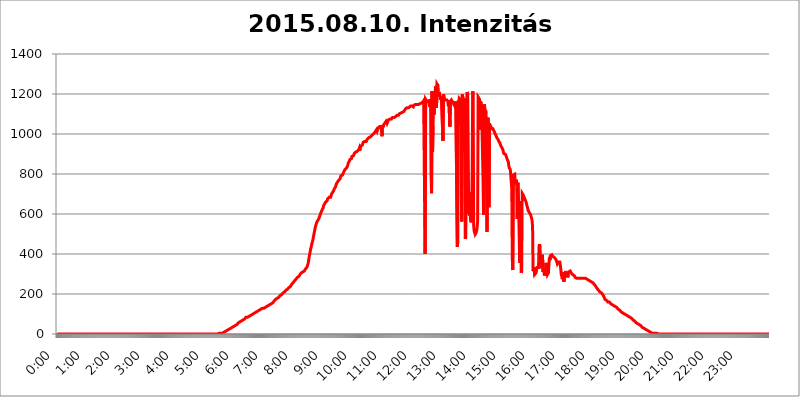
| Category | 2015.08.10. Intenzitás [W/m^2] |
|---|---|
| 0.0 | 0 |
| 0.0006944444444444445 | 0 |
| 0.001388888888888889 | 0 |
| 0.0020833333333333333 | 0 |
| 0.002777777777777778 | 0 |
| 0.003472222222222222 | 0 |
| 0.004166666666666667 | 0 |
| 0.004861111111111111 | 0 |
| 0.005555555555555556 | 0 |
| 0.0062499999999999995 | 0 |
| 0.006944444444444444 | 0 |
| 0.007638888888888889 | 0 |
| 0.008333333333333333 | 0 |
| 0.009027777777777779 | 0 |
| 0.009722222222222222 | 0 |
| 0.010416666666666666 | 0 |
| 0.011111111111111112 | 0 |
| 0.011805555555555555 | 0 |
| 0.012499999999999999 | 0 |
| 0.013194444444444444 | 0 |
| 0.013888888888888888 | 0 |
| 0.014583333333333332 | 0 |
| 0.015277777777777777 | 0 |
| 0.015972222222222224 | 0 |
| 0.016666666666666666 | 0 |
| 0.017361111111111112 | 0 |
| 0.018055555555555557 | 0 |
| 0.01875 | 0 |
| 0.019444444444444445 | 0 |
| 0.02013888888888889 | 0 |
| 0.020833333333333332 | 0 |
| 0.02152777777777778 | 0 |
| 0.022222222222222223 | 0 |
| 0.02291666666666667 | 0 |
| 0.02361111111111111 | 0 |
| 0.024305555555555556 | 0 |
| 0.024999999999999998 | 0 |
| 0.025694444444444447 | 0 |
| 0.02638888888888889 | 0 |
| 0.027083333333333334 | 0 |
| 0.027777777777777776 | 0 |
| 0.02847222222222222 | 0 |
| 0.029166666666666664 | 0 |
| 0.029861111111111113 | 0 |
| 0.030555555555555555 | 0 |
| 0.03125 | 0 |
| 0.03194444444444445 | 0 |
| 0.03263888888888889 | 0 |
| 0.03333333333333333 | 0 |
| 0.034027777777777775 | 0 |
| 0.034722222222222224 | 0 |
| 0.035416666666666666 | 0 |
| 0.036111111111111115 | 0 |
| 0.03680555555555556 | 0 |
| 0.0375 | 0 |
| 0.03819444444444444 | 0 |
| 0.03888888888888889 | 0 |
| 0.03958333333333333 | 0 |
| 0.04027777777777778 | 0 |
| 0.04097222222222222 | 0 |
| 0.041666666666666664 | 0 |
| 0.042361111111111106 | 0 |
| 0.04305555555555556 | 0 |
| 0.043750000000000004 | 0 |
| 0.044444444444444446 | 0 |
| 0.04513888888888889 | 0 |
| 0.04583333333333334 | 0 |
| 0.04652777777777778 | 0 |
| 0.04722222222222222 | 0 |
| 0.04791666666666666 | 0 |
| 0.04861111111111111 | 0 |
| 0.049305555555555554 | 0 |
| 0.049999999999999996 | 0 |
| 0.05069444444444445 | 0 |
| 0.051388888888888894 | 0 |
| 0.052083333333333336 | 0 |
| 0.05277777777777778 | 0 |
| 0.05347222222222222 | 0 |
| 0.05416666666666667 | 0 |
| 0.05486111111111111 | 0 |
| 0.05555555555555555 | 0 |
| 0.05625 | 0 |
| 0.05694444444444444 | 0 |
| 0.057638888888888885 | 0 |
| 0.05833333333333333 | 0 |
| 0.05902777777777778 | 0 |
| 0.059722222222222225 | 0 |
| 0.06041666666666667 | 0 |
| 0.061111111111111116 | 0 |
| 0.06180555555555556 | 0 |
| 0.0625 | 0 |
| 0.06319444444444444 | 0 |
| 0.06388888888888888 | 0 |
| 0.06458333333333334 | 0 |
| 0.06527777777777778 | 0 |
| 0.06597222222222222 | 0 |
| 0.06666666666666667 | 0 |
| 0.06736111111111111 | 0 |
| 0.06805555555555555 | 0 |
| 0.06874999999999999 | 0 |
| 0.06944444444444443 | 0 |
| 0.07013888888888889 | 0 |
| 0.07083333333333333 | 0 |
| 0.07152777777777779 | 0 |
| 0.07222222222222223 | 0 |
| 0.07291666666666667 | 0 |
| 0.07361111111111111 | 0 |
| 0.07430555555555556 | 0 |
| 0.075 | 0 |
| 0.07569444444444444 | 0 |
| 0.0763888888888889 | 0 |
| 0.07708333333333334 | 0 |
| 0.07777777777777778 | 0 |
| 0.07847222222222222 | 0 |
| 0.07916666666666666 | 0 |
| 0.0798611111111111 | 0 |
| 0.08055555555555556 | 0 |
| 0.08125 | 0 |
| 0.08194444444444444 | 0 |
| 0.08263888888888889 | 0 |
| 0.08333333333333333 | 0 |
| 0.08402777777777777 | 0 |
| 0.08472222222222221 | 0 |
| 0.08541666666666665 | 0 |
| 0.08611111111111112 | 0 |
| 0.08680555555555557 | 0 |
| 0.08750000000000001 | 0 |
| 0.08819444444444445 | 0 |
| 0.08888888888888889 | 0 |
| 0.08958333333333333 | 0 |
| 0.09027777777777778 | 0 |
| 0.09097222222222222 | 0 |
| 0.09166666666666667 | 0 |
| 0.09236111111111112 | 0 |
| 0.09305555555555556 | 0 |
| 0.09375 | 0 |
| 0.09444444444444444 | 0 |
| 0.09513888888888888 | 0 |
| 0.09583333333333333 | 0 |
| 0.09652777777777777 | 0 |
| 0.09722222222222222 | 0 |
| 0.09791666666666667 | 0 |
| 0.09861111111111111 | 0 |
| 0.09930555555555555 | 0 |
| 0.09999999999999999 | 0 |
| 0.10069444444444443 | 0 |
| 0.1013888888888889 | 0 |
| 0.10208333333333335 | 0 |
| 0.10277777777777779 | 0 |
| 0.10347222222222223 | 0 |
| 0.10416666666666667 | 0 |
| 0.10486111111111111 | 0 |
| 0.10555555555555556 | 0 |
| 0.10625 | 0 |
| 0.10694444444444444 | 0 |
| 0.1076388888888889 | 0 |
| 0.10833333333333334 | 0 |
| 0.10902777777777778 | 0 |
| 0.10972222222222222 | 0 |
| 0.1111111111111111 | 0 |
| 0.11180555555555556 | 0 |
| 0.11180555555555556 | 0 |
| 0.1125 | 0 |
| 0.11319444444444444 | 0 |
| 0.11388888888888889 | 0 |
| 0.11458333333333333 | 0 |
| 0.11527777777777777 | 0 |
| 0.11597222222222221 | 0 |
| 0.11666666666666665 | 0 |
| 0.1173611111111111 | 0 |
| 0.11805555555555557 | 0 |
| 0.11944444444444445 | 0 |
| 0.12013888888888889 | 0 |
| 0.12083333333333333 | 0 |
| 0.12152777777777778 | 0 |
| 0.12222222222222223 | 0 |
| 0.12291666666666667 | 0 |
| 0.12291666666666667 | 0 |
| 0.12361111111111112 | 0 |
| 0.12430555555555556 | 0 |
| 0.125 | 0 |
| 0.12569444444444444 | 0 |
| 0.12638888888888888 | 0 |
| 0.12708333333333333 | 0 |
| 0.16875 | 0 |
| 0.12847222222222224 | 0 |
| 0.12916666666666668 | 0 |
| 0.12986111111111112 | 0 |
| 0.13055555555555556 | 0 |
| 0.13125 | 0 |
| 0.13194444444444445 | 0 |
| 0.1326388888888889 | 0 |
| 0.13333333333333333 | 0 |
| 0.13402777777777777 | 0 |
| 0.13402777777777777 | 0 |
| 0.13472222222222222 | 0 |
| 0.13541666666666666 | 0 |
| 0.1361111111111111 | 0 |
| 0.13749999999999998 | 0 |
| 0.13819444444444443 | 0 |
| 0.1388888888888889 | 0 |
| 0.13958333333333334 | 0 |
| 0.14027777777777778 | 0 |
| 0.14097222222222222 | 0 |
| 0.14166666666666666 | 0 |
| 0.1423611111111111 | 0 |
| 0.14305555555555557 | 0 |
| 0.14375000000000002 | 0 |
| 0.14444444444444446 | 0 |
| 0.1451388888888889 | 0 |
| 0.1451388888888889 | 0 |
| 0.14652777777777778 | 0 |
| 0.14722222222222223 | 0 |
| 0.14791666666666667 | 0 |
| 0.1486111111111111 | 0 |
| 0.14930555555555555 | 0 |
| 0.15 | 0 |
| 0.15069444444444444 | 0 |
| 0.15138888888888888 | 0 |
| 0.15208333333333332 | 0 |
| 0.15277777777777776 | 0 |
| 0.15347222222222223 | 0 |
| 0.15416666666666667 | 0 |
| 0.15486111111111112 | 0 |
| 0.15555555555555556 | 0 |
| 0.15625 | 0 |
| 0.15694444444444444 | 0 |
| 0.15763888888888888 | 0 |
| 0.15833333333333333 | 0 |
| 0.15902777777777777 | 0 |
| 0.15972222222222224 | 0 |
| 0.16041666666666668 | 0 |
| 0.16111111111111112 | 0 |
| 0.16180555555555556 | 0 |
| 0.1625 | 0 |
| 0.16319444444444445 | 0 |
| 0.1638888888888889 | 0 |
| 0.16458333333333333 | 0 |
| 0.16527777777777777 | 0 |
| 0.16597222222222222 | 0 |
| 0.16666666666666666 | 0 |
| 0.1673611111111111 | 0 |
| 0.16805555555555554 | 0 |
| 0.16874999999999998 | 0 |
| 0.16944444444444443 | 0 |
| 0.17013888888888887 | 0 |
| 0.1708333333333333 | 0 |
| 0.17152777777777775 | 0 |
| 0.17222222222222225 | 0 |
| 0.1729166666666667 | 0 |
| 0.17361111111111113 | 0 |
| 0.17430555555555557 | 0 |
| 0.17500000000000002 | 0 |
| 0.17569444444444446 | 0 |
| 0.1763888888888889 | 0 |
| 0.17708333333333334 | 0 |
| 0.17777777777777778 | 0 |
| 0.17847222222222223 | 0 |
| 0.17916666666666667 | 0 |
| 0.1798611111111111 | 0 |
| 0.18055555555555555 | 0 |
| 0.18125 | 0 |
| 0.18194444444444444 | 0 |
| 0.1826388888888889 | 0 |
| 0.18333333333333335 | 0 |
| 0.1840277777777778 | 0 |
| 0.18472222222222223 | 0 |
| 0.18541666666666667 | 0 |
| 0.18611111111111112 | 0 |
| 0.18680555555555556 | 0 |
| 0.1875 | 0 |
| 0.18819444444444444 | 0 |
| 0.18888888888888888 | 0 |
| 0.18958333333333333 | 0 |
| 0.19027777777777777 | 0 |
| 0.1909722222222222 | 0 |
| 0.19166666666666665 | 0 |
| 0.19236111111111112 | 0 |
| 0.19305555555555554 | 0 |
| 0.19375 | 0 |
| 0.19444444444444445 | 0 |
| 0.1951388888888889 | 0 |
| 0.19583333333333333 | 0 |
| 0.19652777777777777 | 0 |
| 0.19722222222222222 | 0 |
| 0.19791666666666666 | 0 |
| 0.1986111111111111 | 0 |
| 0.19930555555555554 | 0 |
| 0.19999999999999998 | 0 |
| 0.20069444444444443 | 0 |
| 0.20138888888888887 | 0 |
| 0.2020833333333333 | 0 |
| 0.2027777777777778 | 0 |
| 0.2034722222222222 | 0 |
| 0.2041666666666667 | 0 |
| 0.20486111111111113 | 0 |
| 0.20555555555555557 | 0 |
| 0.20625000000000002 | 0 |
| 0.20694444444444446 | 0 |
| 0.2076388888888889 | 0 |
| 0.20833333333333334 | 0 |
| 0.20902777777777778 | 0 |
| 0.20972222222222223 | 0 |
| 0.21041666666666667 | 0 |
| 0.2111111111111111 | 0 |
| 0.21180555555555555 | 0 |
| 0.2125 | 0 |
| 0.21319444444444444 | 0 |
| 0.2138888888888889 | 0 |
| 0.21458333333333335 | 0 |
| 0.2152777777777778 | 0 |
| 0.21597222222222223 | 0 |
| 0.21666666666666667 | 0 |
| 0.21736111111111112 | 0 |
| 0.21805555555555556 | 0 |
| 0.21875 | 0 |
| 0.21944444444444444 | 0 |
| 0.22013888888888888 | 0 |
| 0.22083333333333333 | 0 |
| 0.22152777777777777 | 0 |
| 0.2222222222222222 | 0 |
| 0.22291666666666665 | 0 |
| 0.2236111111111111 | 0 |
| 0.22430555555555556 | 0 |
| 0.225 | 0 |
| 0.22569444444444445 | 0 |
| 0.2263888888888889 | 0 |
| 0.22708333333333333 | 3.525 |
| 0.22777777777777777 | 0 |
| 0.22847222222222222 | 3.525 |
| 0.22916666666666666 | 3.525 |
| 0.2298611111111111 | 3.525 |
| 0.23055555555555554 | 3.525 |
| 0.23124999999999998 | 3.525 |
| 0.23194444444444443 | 3.525 |
| 0.23263888888888887 | 7.887 |
| 0.2333333333333333 | 7.887 |
| 0.2340277777777778 | 7.887 |
| 0.2347222222222222 | 12.257 |
| 0.2354166666666667 | 12.257 |
| 0.23611111111111113 | 12.257 |
| 0.23680555555555557 | 12.257 |
| 0.23750000000000002 | 16.636 |
| 0.23819444444444446 | 16.636 |
| 0.2388888888888889 | 16.636 |
| 0.23958333333333334 | 21.024 |
| 0.24027777777777778 | 21.024 |
| 0.24097222222222223 | 25.419 |
| 0.24166666666666667 | 25.419 |
| 0.2423611111111111 | 25.419 |
| 0.24305555555555555 | 29.823 |
| 0.24375 | 29.823 |
| 0.24444444444444446 | 34.234 |
| 0.24513888888888888 | 34.234 |
| 0.24583333333333335 | 34.234 |
| 0.2465277777777778 | 38.653 |
| 0.24722222222222223 | 38.653 |
| 0.24791666666666667 | 38.653 |
| 0.24861111111111112 | 43.079 |
| 0.24930555555555556 | 43.079 |
| 0.25 | 43.079 |
| 0.25069444444444444 | 47.511 |
| 0.2513888888888889 | 47.511 |
| 0.2520833333333333 | 47.511 |
| 0.25277777777777777 | 51.951 |
| 0.2534722222222222 | 51.951 |
| 0.25416666666666665 | 56.398 |
| 0.2548611111111111 | 56.398 |
| 0.2555555555555556 | 60.85 |
| 0.25625000000000003 | 60.85 |
| 0.2569444444444445 | 60.85 |
| 0.2576388888888889 | 65.31 |
| 0.25833333333333336 | 65.31 |
| 0.2590277777777778 | 65.31 |
| 0.25972222222222224 | 69.775 |
| 0.2604166666666667 | 69.775 |
| 0.2611111111111111 | 74.246 |
| 0.26180555555555557 | 74.246 |
| 0.2625 | 74.246 |
| 0.26319444444444445 | 78.722 |
| 0.2638888888888889 | 78.722 |
| 0.26458333333333334 | 83.205 |
| 0.2652777777777778 | 83.205 |
| 0.2659722222222222 | 83.205 |
| 0.26666666666666666 | 83.205 |
| 0.2673611111111111 | 83.205 |
| 0.26805555555555555 | 87.692 |
| 0.26875 | 87.692 |
| 0.26944444444444443 | 87.692 |
| 0.2701388888888889 | 92.184 |
| 0.2708333333333333 | 92.184 |
| 0.27152777777777776 | 92.184 |
| 0.2722222222222222 | 96.682 |
| 0.27291666666666664 | 96.682 |
| 0.2736111111111111 | 96.682 |
| 0.2743055555555555 | 101.184 |
| 0.27499999999999997 | 101.184 |
| 0.27569444444444446 | 101.184 |
| 0.27638888888888885 | 105.69 |
| 0.27708333333333335 | 105.69 |
| 0.2777777777777778 | 105.69 |
| 0.27847222222222223 | 110.201 |
| 0.2791666666666667 | 110.201 |
| 0.2798611111111111 | 110.201 |
| 0.28055555555555556 | 114.716 |
| 0.28125 | 114.716 |
| 0.28194444444444444 | 114.716 |
| 0.2826388888888889 | 119.235 |
| 0.2833333333333333 | 119.235 |
| 0.28402777777777777 | 119.235 |
| 0.2847222222222222 | 119.235 |
| 0.28541666666666665 | 123.758 |
| 0.28611111111111115 | 123.758 |
| 0.28680555555555554 | 123.758 |
| 0.28750000000000003 | 128.284 |
| 0.2881944444444445 | 128.284 |
| 0.2888888888888889 | 128.284 |
| 0.28958333333333336 | 128.284 |
| 0.2902777777777778 | 128.284 |
| 0.29097222222222224 | 132.814 |
| 0.2916666666666667 | 132.814 |
| 0.2923611111111111 | 132.814 |
| 0.29305555555555557 | 137.347 |
| 0.29375 | 137.347 |
| 0.29444444444444445 | 137.347 |
| 0.2951388888888889 | 141.884 |
| 0.29583333333333334 | 141.884 |
| 0.2965277777777778 | 141.884 |
| 0.2972222222222222 | 146.423 |
| 0.29791666666666666 | 146.423 |
| 0.2986111111111111 | 146.423 |
| 0.29930555555555555 | 150.964 |
| 0.3 | 150.964 |
| 0.30069444444444443 | 150.964 |
| 0.3013888888888889 | 155.509 |
| 0.3020833333333333 | 155.509 |
| 0.30277777777777776 | 155.509 |
| 0.3034722222222222 | 160.056 |
| 0.30416666666666664 | 164.605 |
| 0.3048611111111111 | 164.605 |
| 0.3055555555555555 | 169.156 |
| 0.30624999999999997 | 173.709 |
| 0.3069444444444444 | 173.709 |
| 0.3076388888888889 | 173.709 |
| 0.30833333333333335 | 178.264 |
| 0.3090277777777778 | 178.264 |
| 0.30972222222222223 | 182.82 |
| 0.3104166666666667 | 182.82 |
| 0.3111111111111111 | 187.378 |
| 0.31180555555555556 | 187.378 |
| 0.3125 | 191.937 |
| 0.31319444444444444 | 191.937 |
| 0.3138888888888889 | 196.497 |
| 0.3145833333333333 | 196.497 |
| 0.31527777777777777 | 201.058 |
| 0.3159722222222222 | 201.058 |
| 0.31666666666666665 | 205.62 |
| 0.31736111111111115 | 210.182 |
| 0.31805555555555554 | 210.182 |
| 0.31875000000000003 | 210.182 |
| 0.3194444444444445 | 214.746 |
| 0.3201388888888889 | 214.746 |
| 0.32083333333333336 | 219.309 |
| 0.3215277777777778 | 219.309 |
| 0.32222222222222224 | 223.873 |
| 0.3229166666666667 | 223.873 |
| 0.3236111111111111 | 228.436 |
| 0.32430555555555557 | 228.436 |
| 0.325 | 233 |
| 0.32569444444444445 | 233 |
| 0.3263888888888889 | 237.564 |
| 0.32708333333333334 | 237.564 |
| 0.3277777777777778 | 242.127 |
| 0.3284722222222222 | 246.689 |
| 0.32916666666666666 | 246.689 |
| 0.3298611111111111 | 251.251 |
| 0.33055555555555555 | 255.813 |
| 0.33125 | 260.373 |
| 0.33194444444444443 | 260.373 |
| 0.3326388888888889 | 264.932 |
| 0.3333333333333333 | 269.49 |
| 0.3340277777777778 | 269.49 |
| 0.3347222222222222 | 274.047 |
| 0.3354166666666667 | 278.603 |
| 0.3361111111111111 | 278.603 |
| 0.3368055555555556 | 283.156 |
| 0.33749999999999997 | 283.156 |
| 0.33819444444444446 | 287.709 |
| 0.33888888888888885 | 287.709 |
| 0.33958333333333335 | 292.259 |
| 0.34027777777777773 | 296.808 |
| 0.34097222222222223 | 296.808 |
| 0.3416666666666666 | 301.354 |
| 0.3423611111111111 | 305.898 |
| 0.3430555555555555 | 305.898 |
| 0.34375 | 305.898 |
| 0.3444444444444445 | 310.44 |
| 0.3451388888888889 | 314.98 |
| 0.3458333333333334 | 314.98 |
| 0.34652777777777777 | 314.98 |
| 0.34722222222222227 | 319.517 |
| 0.34791666666666665 | 324.052 |
| 0.34861111111111115 | 324.052 |
| 0.34930555555555554 | 328.584 |
| 0.35000000000000003 | 333.113 |
| 0.3506944444444444 | 337.639 |
| 0.3513888888888889 | 346.682 |
| 0.3520833333333333 | 355.712 |
| 0.3527777777777778 | 373.729 |
| 0.3534722222222222 | 387.202 |
| 0.3541666666666667 | 400.638 |
| 0.3548611111111111 | 414.035 |
| 0.35555555555555557 | 427.39 |
| 0.35625 | 436.27 |
| 0.35694444444444445 | 449.551 |
| 0.3576388888888889 | 453.968 |
| 0.35833333333333334 | 467.187 |
| 0.3590277777777778 | 480.356 |
| 0.3597222222222222 | 493.475 |
| 0.36041666666666666 | 506.542 |
| 0.3611111111111111 | 519.555 |
| 0.36180555555555555 | 532.513 |
| 0.3625 | 541.121 |
| 0.36319444444444443 | 545.416 |
| 0.3638888888888889 | 558.261 |
| 0.3645833333333333 | 562.53 |
| 0.3652777777777778 | 566.793 |
| 0.3659722222222222 | 571.049 |
| 0.3666666666666667 | 575.299 |
| 0.3673611111111111 | 579.542 |
| 0.3680555555555556 | 588.009 |
| 0.36874999999999997 | 596.45 |
| 0.36944444444444446 | 600.661 |
| 0.37013888888888885 | 609.062 |
| 0.37083333333333335 | 613.252 |
| 0.37152777777777773 | 621.613 |
| 0.37222222222222223 | 625.784 |
| 0.3729166666666666 | 629.948 |
| 0.3736111111111111 | 642.4 |
| 0.3743055555555555 | 646.537 |
| 0.375 | 650.667 |
| 0.3756944444444445 | 654.791 |
| 0.3763888888888889 | 658.909 |
| 0.3770833333333334 | 658.909 |
| 0.37777777777777777 | 663.019 |
| 0.37847222222222227 | 667.123 |
| 0.37916666666666665 | 675.311 |
| 0.37986111111111115 | 675.311 |
| 0.38055555555555554 | 679.395 |
| 0.38125000000000003 | 683.473 |
| 0.3819444444444444 | 687.544 |
| 0.3826388888888889 | 687.544 |
| 0.3833333333333333 | 683.473 |
| 0.3840277777777778 | 691.608 |
| 0.3847222222222222 | 699.717 |
| 0.3854166666666667 | 703.762 |
| 0.3861111111111111 | 707.8 |
| 0.38680555555555557 | 711.832 |
| 0.3875 | 715.858 |
| 0.38819444444444445 | 719.877 |
| 0.3888888888888889 | 727.896 |
| 0.38958333333333334 | 727.896 |
| 0.3902777777777778 | 735.89 |
| 0.3909722222222222 | 743.859 |
| 0.39166666666666666 | 751.803 |
| 0.3923611111111111 | 755.766 |
| 0.39305555555555555 | 759.723 |
| 0.39375 | 763.674 |
| 0.39444444444444443 | 767.62 |
| 0.3951388888888889 | 767.62 |
| 0.3958333333333333 | 771.559 |
| 0.3965277777777778 | 775.492 |
| 0.3972222222222222 | 783.342 |
| 0.3979166666666667 | 791.169 |
| 0.3986111111111111 | 787.258 |
| 0.3993055555555556 | 791.169 |
| 0.39999999999999997 | 795.074 |
| 0.40069444444444446 | 798.974 |
| 0.40138888888888885 | 806.757 |
| 0.40208333333333335 | 810.641 |
| 0.40277777777777773 | 810.641 |
| 0.40347222222222223 | 822.26 |
| 0.4041666666666666 | 822.26 |
| 0.4048611111111111 | 826.123 |
| 0.4055555555555555 | 829.981 |
| 0.40625 | 833.834 |
| 0.4069444444444445 | 837.682 |
| 0.4076388888888889 | 841.526 |
| 0.4083333333333334 | 856.855 |
| 0.40902777777777777 | 860.676 |
| 0.40972222222222227 | 864.493 |
| 0.41041666666666665 | 872.114 |
| 0.41111111111111115 | 872.114 |
| 0.41180555555555554 | 875.918 |
| 0.41250000000000003 | 875.918 |
| 0.4131944444444444 | 887.309 |
| 0.4138888888888889 | 887.309 |
| 0.4145833333333333 | 887.309 |
| 0.4152777777777778 | 891.099 |
| 0.4159722222222222 | 894.885 |
| 0.4166666666666667 | 902.447 |
| 0.4173611111111111 | 902.447 |
| 0.41805555555555557 | 902.447 |
| 0.41875 | 909.996 |
| 0.41944444444444445 | 913.766 |
| 0.4201388888888889 | 913.766 |
| 0.42083333333333334 | 913.766 |
| 0.4215277777777778 | 913.766 |
| 0.4222222222222222 | 913.766 |
| 0.42291666666666666 | 921.298 |
| 0.4236111111111111 | 928.819 |
| 0.42430555555555555 | 917.534 |
| 0.425 | 932.576 |
| 0.42569444444444443 | 940.082 |
| 0.4263888888888889 | 943.832 |
| 0.4270833333333333 | 940.082 |
| 0.4277777777777778 | 943.832 |
| 0.4284722222222222 | 951.327 |
| 0.4291666666666667 | 958.814 |
| 0.4298611111111111 | 958.814 |
| 0.4305555555555556 | 962.555 |
| 0.43124999999999997 | 962.555 |
| 0.43194444444444446 | 966.295 |
| 0.43263888888888885 | 962.555 |
| 0.43333333333333335 | 962.555 |
| 0.43402777777777773 | 966.295 |
| 0.43472222222222223 | 973.772 |
| 0.4354166666666666 | 977.508 |
| 0.4361111111111111 | 977.508 |
| 0.4368055555555555 | 981.244 |
| 0.4375 | 981.244 |
| 0.4381944444444445 | 984.98 |
| 0.4388888888888889 | 984.98 |
| 0.4395833333333334 | 984.98 |
| 0.44027777777777777 | 988.714 |
| 0.44097222222222227 | 992.448 |
| 0.44166666666666665 | 992.448 |
| 0.44236111111111115 | 996.182 |
| 0.44305555555555554 | 999.916 |
| 0.44375000000000003 | 999.916 |
| 0.4444444444444444 | 999.916 |
| 0.4451388888888889 | 1007.383 |
| 0.4458333333333333 | 1011.118 |
| 0.4465277777777778 | 1014.852 |
| 0.4472222222222222 | 1014.852 |
| 0.4479166666666667 | 1022.323 |
| 0.4486111111111111 | 1014.852 |
| 0.44930555555555557 | 1022.323 |
| 0.45 | 1029.798 |
| 0.45069444444444445 | 1026.06 |
| 0.4513888888888889 | 1033.537 |
| 0.45208333333333334 | 1037.277 |
| 0.4527777777777778 | 1037.277 |
| 0.4534722222222222 | 1033.537 |
| 0.45416666666666666 | 1037.277 |
| 0.4548611111111111 | 1037.277 |
| 0.45555555555555555 | 988.714 |
| 0.45625 | 1044.762 |
| 0.45694444444444443 | 1033.537 |
| 0.4576388888888889 | 1044.762 |
| 0.4583333333333333 | 1044.762 |
| 0.4590277777777778 | 1052.255 |
| 0.4597222222222222 | 1052.255 |
| 0.4604166666666667 | 1056.004 |
| 0.4611111111111111 | 1063.51 |
| 0.4618055555555556 | 1063.51 |
| 0.46249999999999997 | 1052.255 |
| 0.46319444444444446 | 1056.004 |
| 0.46388888888888885 | 1052.255 |
| 0.46458333333333335 | 1071.027 |
| 0.46527777777777773 | 1071.027 |
| 0.46597222222222223 | 1071.027 |
| 0.4666666666666666 | 1074.789 |
| 0.4673611111111111 | 1074.789 |
| 0.4680555555555555 | 1074.789 |
| 0.46875 | 1074.789 |
| 0.4694444444444445 | 1078.555 |
| 0.4701388888888889 | 1082.324 |
| 0.4708333333333334 | 1078.555 |
| 0.47152777777777777 | 1082.324 |
| 0.47222222222222227 | 1082.324 |
| 0.47291666666666665 | 1086.097 |
| 0.47361111111111115 | 1086.097 |
| 0.47430555555555554 | 1086.097 |
| 0.47500000000000003 | 1089.873 |
| 0.4756944444444444 | 1089.873 |
| 0.4763888888888889 | 1093.653 |
| 0.4770833333333333 | 1093.653 |
| 0.4777777777777778 | 1093.653 |
| 0.4784722222222222 | 1093.653 |
| 0.4791666666666667 | 1097.437 |
| 0.4798611111111111 | 1101.226 |
| 0.48055555555555557 | 1105.019 |
| 0.48125 | 1105.019 |
| 0.48194444444444445 | 1105.019 |
| 0.4826388888888889 | 1105.019 |
| 0.48333333333333334 | 1105.019 |
| 0.4840277777777778 | 1108.816 |
| 0.4847222222222222 | 1108.816 |
| 0.48541666666666666 | 1112.618 |
| 0.4861111111111111 | 1112.618 |
| 0.48680555555555555 | 1116.426 |
| 0.4875 | 1120.238 |
| 0.48819444444444443 | 1124.056 |
| 0.4888888888888889 | 1127.879 |
| 0.4895833333333333 | 1127.879 |
| 0.4902777777777778 | 1127.879 |
| 0.4909722222222222 | 1131.708 |
| 0.4916666666666667 | 1131.708 |
| 0.4923611111111111 | 1131.708 |
| 0.4930555555555556 | 1131.708 |
| 0.49374999999999997 | 1135.543 |
| 0.49444444444444446 | 1135.543 |
| 0.49513888888888885 | 1139.384 |
| 0.49583333333333335 | 1135.543 |
| 0.49652777777777773 | 1139.384 |
| 0.49722222222222223 | 1139.384 |
| 0.4979166666666666 | 1139.384 |
| 0.4986111111111111 | 1143.232 |
| 0.4993055555555555 | 1135.543 |
| 0.5 | 1143.232 |
| 0.5006944444444444 | 1147.086 |
| 0.5013888888888889 | 1147.086 |
| 0.5020833333333333 | 1147.086 |
| 0.5027777777777778 | 1147.086 |
| 0.5034722222222222 | 1147.086 |
| 0.5041666666666667 | 1147.086 |
| 0.5048611111111111 | 1147.086 |
| 0.5055555555555555 | 1147.086 |
| 0.50625 | 1147.086 |
| 0.5069444444444444 | 1147.086 |
| 0.5076388888888889 | 1147.086 |
| 0.5083333333333333 | 1150.946 |
| 0.5090277777777777 | 1150.946 |
| 0.5097222222222222 | 1154.814 |
| 0.5104166666666666 | 1154.814 |
| 0.5111111111111112 | 1158.689 |
| 0.5118055555555555 | 1158.689 |
| 0.5125000000000001 | 1158.689 |
| 0.5131944444444444 | 1154.814 |
| 0.513888888888889 | 1166.46 |
| 0.5145833333333333 | 1170.358 |
| 0.5152777777777778 | 1166.46 |
| 0.5159722222222222 | 400.638 |
| 0.5166666666666667 | 1174.263 |
| 0.517361111111111 | 1174.263 |
| 0.5180555555555556 | 1166.46 |
| 0.5187499999999999 | 1166.46 |
| 0.5194444444444445 | 1170.358 |
| 0.5201388888888888 | 1162.571 |
| 0.5208333333333334 | 1162.571 |
| 0.5215277777777778 | 1154.814 |
| 0.5222222222222223 | 1135.543 |
| 0.5229166666666667 | 1174.263 |
| 0.5236111111111111 | 1162.571 |
| 0.5243055555555556 | 795.074 |
| 0.525 | 703.762 |
| 0.5256944444444445 | 1213.804 |
| 0.5263888888888889 | 909.996 |
| 0.5270833333333333 | 1041.019 |
| 0.5277777777777778 | 1170.358 |
| 0.5284722222222222 | 1097.437 |
| 0.5291666666666667 | 1186.03 |
| 0.5298611111111111 | 1193.918 |
| 0.5305555555555556 | 1238.014 |
| 0.53125 | 1242.089 |
| 0.5319444444444444 | 1131.708 |
| 0.5326388888888889 | 1250.275 |
| 0.5333333333333333 | 1250.275 |
| 0.5340277777777778 | 1242.089 |
| 0.5347222222222222 | 1186.03 |
| 0.5354166666666667 | 1209.807 |
| 0.5361111111111111 | 1205.82 |
| 0.5368055555555555 | 1189.969 |
| 0.5375 | 1170.358 |
| 0.5381944444444444 | 1178.177 |
| 0.5388888888888889 | 1189.969 |
| 0.5395833333333333 | 1189.969 |
| 0.5402777777777777 | 1186.03 |
| 0.5409722222222222 | 966.295 |
| 0.5416666666666666 | 1197.876 |
| 0.5423611111111112 | 1189.969 |
| 0.5430555555555555 | 1178.177 |
| 0.5437500000000001 | 1178.177 |
| 0.5444444444444444 | 1170.358 |
| 0.545138888888889 | 1174.263 |
| 0.5458333333333333 | 1170.358 |
| 0.5465277777777778 | 1170.358 |
| 0.5472222222222222 | 1170.358 |
| 0.5479166666666667 | 1162.571 |
| 0.548611111111111 | 1139.384 |
| 0.5493055555555556 | 1166.46 |
| 0.5499999999999999 | 1162.571 |
| 0.5506944444444445 | 1037.277 |
| 0.5513888888888888 | 1162.571 |
| 0.5520833333333334 | 1166.46 |
| 0.5527777777777778 | 1170.358 |
| 0.5534722222222223 | 1166.46 |
| 0.5541666666666667 | 1162.571 |
| 0.5548611111111111 | 1162.571 |
| 0.5555555555555556 | 1154.814 |
| 0.55625 | 1147.086 |
| 0.5569444444444445 | 1147.086 |
| 0.5576388888888889 | 1139.384 |
| 0.5583333333333333 | 1154.814 |
| 0.5590277777777778 | 1162.571 |
| 0.5597222222222222 | 1162.571 |
| 0.5604166666666667 | 1162.571 |
| 0.5611111111111111 | 436.27 |
| 0.5618055555555556 | 462.786 |
| 0.5625 | 1166.46 |
| 0.5631944444444444 | 1044.762 |
| 0.5638888888888889 | 1178.177 |
| 0.5645833333333333 | 1174.263 |
| 0.5652777777777778 | 1174.263 |
| 0.5659722222222222 | 1170.358 |
| 0.5666666666666667 | 707.8 |
| 0.5673611111111111 | 562.53 |
| 0.5680555555555555 | 1197.876 |
| 0.56875 | 1186.03 |
| 0.5694444444444444 | 1178.177 |
| 0.5701388888888889 | 909.996 |
| 0.5708333333333333 | 1178.177 |
| 0.5715277777777777 | 1154.814 |
| 0.5722222222222222 | 475.972 |
| 0.5729166666666666 | 484.735 |
| 0.5736111111111112 | 703.762 |
| 0.5743055555555555 | 600.661 |
| 0.5750000000000001 | 1209.807 |
| 0.5756944444444444 | 1201.843 |
| 0.576388888888889 | 1201.843 |
| 0.5770833333333333 | 604.864 |
| 0.5777777777777778 | 707.8 |
| 0.5784722222222222 | 592.233 |
| 0.5791666666666667 | 642.4 |
| 0.579861111111111 | 566.793 |
| 0.5805555555555556 | 558.261 |
| 0.5812499999999999 | 579.542 |
| 0.5819444444444445 | 795.074 |
| 0.5826388888888888 | 1213.804 |
| 0.5833333333333334 | 1197.876 |
| 0.5840277777777778 | 541.121 |
| 0.5847222222222223 | 515.223 |
| 0.5854166666666667 | 506.542 |
| 0.5861111111111111 | 497.836 |
| 0.5868055555555556 | 497.836 |
| 0.5875 | 506.542 |
| 0.5881944444444445 | 515.223 |
| 0.5888888888888889 | 532.513 |
| 0.5895833333333333 | 562.53 |
| 0.5902777777777778 | 1186.03 |
| 0.5909722222222222 | 1186.03 |
| 0.5916666666666667 | 1178.177 |
| 0.5923611111111111 | 1170.358 |
| 0.5930555555555556 | 1022.323 |
| 0.59375 | 1162.571 |
| 0.5944444444444444 | 1154.814 |
| 0.5951388888888889 | 1147.086 |
| 0.5958333333333333 | 1147.086 |
| 0.5965277777777778 | 1147.086 |
| 0.5972222222222222 | 759.723 |
| 0.5979166666666667 | 596.45 |
| 0.5986111111111111 | 592.233 |
| 0.5993055555555555 | 1147.086 |
| 0.6 | 1048.508 |
| 0.6006944444444444 | 1120.238 |
| 0.6013888888888889 | 1105.019 |
| 0.6020833333333333 | 1105.019 |
| 0.6027777777777777 | 510.885 |
| 0.6034722222222222 | 1074.789 |
| 0.6041666666666666 | 1082.324 |
| 0.6048611111111112 | 1044.762 |
| 0.6055555555555555 | 634.105 |
| 0.6062500000000001 | 1052.255 |
| 0.6069444444444444 | 1044.762 |
| 0.607638888888889 | 1041.019 |
| 0.6083333333333333 | 1037.277 |
| 0.6090277777777778 | 1026.06 |
| 0.6097222222222222 | 1029.798 |
| 0.6104166666666667 | 1029.798 |
| 0.611111111111111 | 1026.06 |
| 0.6118055555555556 | 1022.323 |
| 0.6124999999999999 | 1014.852 |
| 0.6131944444444445 | 1011.118 |
| 0.6138888888888888 | 1003.65 |
| 0.6145833333333334 | 999.916 |
| 0.6152777777777778 | 992.448 |
| 0.6159722222222223 | 988.714 |
| 0.6166666666666667 | 981.244 |
| 0.6173611111111111 | 977.508 |
| 0.6180555555555556 | 973.772 |
| 0.61875 | 970.034 |
| 0.6194444444444445 | 962.555 |
| 0.6201388888888889 | 962.555 |
| 0.6208333333333333 | 955.071 |
| 0.6215277777777778 | 951.327 |
| 0.6222222222222222 | 940.082 |
| 0.6229166666666667 | 940.082 |
| 0.6236111111111111 | 932.576 |
| 0.6243055555555556 | 928.819 |
| 0.625 | 921.298 |
| 0.6256944444444444 | 909.996 |
| 0.6263888888888889 | 902.447 |
| 0.6270833333333333 | 902.447 |
| 0.6277777777777778 | 902.447 |
| 0.6284722222222222 | 898.668 |
| 0.6291666666666667 | 894.885 |
| 0.6298611111111111 | 887.309 |
| 0.6305555555555555 | 879.719 |
| 0.63125 | 872.114 |
| 0.6319444444444444 | 868.305 |
| 0.6326388888888889 | 860.676 |
| 0.6333333333333333 | 841.526 |
| 0.6340277777777777 | 829.981 |
| 0.6347222222222222 | 829.981 |
| 0.6354166666666666 | 822.26 |
| 0.6361111111111112 | 826.123 |
| 0.6368055555555555 | 818.392 |
| 0.6375000000000001 | 727.896 |
| 0.6381944444444444 | 378.224 |
| 0.638888888888889 | 319.517 |
| 0.6395833333333333 | 795.074 |
| 0.6402777777777778 | 798.974 |
| 0.6409722222222222 | 795.074 |
| 0.6416666666666667 | 798.974 |
| 0.642361111111111 | 751.803 |
| 0.6430555555555556 | 759.723 |
| 0.6437499999999999 | 771.559 |
| 0.6444444444444445 | 743.859 |
| 0.6451388888888888 | 575.299 |
| 0.6458333333333334 | 755.766 |
| 0.6465277777777778 | 747.834 |
| 0.6472222222222223 | 747.834 |
| 0.6479166666666667 | 743.859 |
| 0.6486111111111111 | 355.712 |
| 0.6493055555555556 | 663.019 |
| 0.65 | 613.252 |
| 0.6506944444444445 | 305.898 |
| 0.6513888888888889 | 314.98 |
| 0.6520833333333333 | 703.762 |
| 0.6527777777777778 | 707.8 |
| 0.6534722222222222 | 695.666 |
| 0.6541666666666667 | 691.608 |
| 0.6548611111111111 | 683.473 |
| 0.6555555555555556 | 679.395 |
| 0.65625 | 671.22 |
| 0.6569444444444444 | 667.123 |
| 0.6576388888888889 | 658.909 |
| 0.6583333333333333 | 646.537 |
| 0.6590277777777778 | 638.256 |
| 0.6597222222222222 | 629.948 |
| 0.6604166666666667 | 617.436 |
| 0.6611111111111111 | 613.252 |
| 0.6618055555555555 | 609.062 |
| 0.6625 | 609.062 |
| 0.6631944444444444 | 604.864 |
| 0.6638888888888889 | 596.45 |
| 0.6645833333333333 | 592.233 |
| 0.6652777777777777 | 579.542 |
| 0.6659722222222222 | 566.793 |
| 0.6666666666666666 | 536.82 |
| 0.6673611111111111 | 314.98 |
| 0.6680555555555556 | 314.98 |
| 0.6687500000000001 | 333.113 |
| 0.6694444444444444 | 296.808 |
| 0.6701388888888888 | 296.808 |
| 0.6708333333333334 | 301.354 |
| 0.6715277777777778 | 305.898 |
| 0.6722222222222222 | 310.44 |
| 0.6729166666666666 | 333.113 |
| 0.6736111111111112 | 328.584 |
| 0.6743055555555556 | 328.584 |
| 0.6749999999999999 | 333.113 |
| 0.6756944444444444 | 436.27 |
| 0.6763888888888889 | 449.551 |
| 0.6770833333333334 | 436.27 |
| 0.6777777777777777 | 369.23 |
| 0.6784722222222223 | 391.685 |
| 0.6791666666666667 | 328.584 |
| 0.6798611111111111 | 342.162 |
| 0.6805555555555555 | 396.164 |
| 0.68125 | 310.44 |
| 0.6819444444444445 | 319.517 |
| 0.6826388888888889 | 310.44 |
| 0.6833333333333332 | 292.259 |
| 0.6840277777777778 | 292.259 |
| 0.6847222222222222 | 319.517 |
| 0.6854166666666667 | 355.712 |
| 0.686111111111111 | 360.221 |
| 0.6868055555555556 | 314.98 |
| 0.6875 | 296.808 |
| 0.6881944444444444 | 301.354 |
| 0.688888888888889 | 305.898 |
| 0.6895833333333333 | 310.44 |
| 0.6902777777777778 | 382.715 |
| 0.6909722222222222 | 369.23 |
| 0.6916666666666668 | 391.685 |
| 0.6923611111111111 | 396.164 |
| 0.6930555555555555 | 396.164 |
| 0.69375 | 396.164 |
| 0.6944444444444445 | 391.685 |
| 0.6951388888888889 | 387.202 |
| 0.6958333333333333 | 387.202 |
| 0.6965277777777777 | 387.202 |
| 0.6972222222222223 | 382.715 |
| 0.6979166666666666 | 378.224 |
| 0.6986111111111111 | 378.224 |
| 0.6993055555555556 | 373.729 |
| 0.7000000000000001 | 369.23 |
| 0.7006944444444444 | 360.221 |
| 0.7013888888888888 | 351.198 |
| 0.7020833333333334 | 355.712 |
| 0.7027777777777778 | 360.221 |
| 0.7034722222222222 | 360.221 |
| 0.7041666666666666 | 360.221 |
| 0.7048611111111112 | 360.221 |
| 0.7055555555555556 | 346.682 |
| 0.7062499999999999 | 342.162 |
| 0.7069444444444444 | 296.808 |
| 0.7076388888888889 | 287.709 |
| 0.7083333333333334 | 274.047 |
| 0.7090277777777777 | 274.047 |
| 0.7097222222222223 | 310.44 |
| 0.7104166666666667 | 260.373 |
| 0.7111111111111111 | 255.813 |
| 0.7118055555555555 | 296.808 |
| 0.7125 | 305.898 |
| 0.7131944444444445 | 314.98 |
| 0.7138888888888889 | 314.98 |
| 0.7145833333333332 | 292.259 |
| 0.7152777777777778 | 305.898 |
| 0.7159722222222222 | 283.156 |
| 0.7166666666666667 | 301.354 |
| 0.717361111111111 | 310.44 |
| 0.7180555555555556 | 314.98 |
| 0.71875 | 314.98 |
| 0.7194444444444444 | 314.98 |
| 0.720138888888889 | 310.44 |
| 0.7208333333333333 | 305.898 |
| 0.7215277777777778 | 305.898 |
| 0.7222222222222222 | 301.354 |
| 0.7229166666666668 | 296.808 |
| 0.7236111111111111 | 292.259 |
| 0.7243055555555555 | 292.259 |
| 0.725 | 292.259 |
| 0.7256944444444445 | 287.709 |
| 0.7263888888888889 | 283.156 |
| 0.7270833333333333 | 278.603 |
| 0.7277777777777777 | 278.603 |
| 0.7284722222222223 | 278.603 |
| 0.7291666666666666 | 278.603 |
| 0.7298611111111111 | 278.603 |
| 0.7305555555555556 | 278.603 |
| 0.7312500000000001 | 278.603 |
| 0.7319444444444444 | 278.603 |
| 0.7326388888888888 | 278.603 |
| 0.7333333333333334 | 278.603 |
| 0.7340277777777778 | 278.603 |
| 0.7347222222222222 | 278.603 |
| 0.7354166666666666 | 278.603 |
| 0.7361111111111112 | 278.603 |
| 0.7368055555555556 | 278.603 |
| 0.7374999999999999 | 278.603 |
| 0.7381944444444444 | 278.603 |
| 0.7388888888888889 | 278.603 |
| 0.7395833333333334 | 278.603 |
| 0.7402777777777777 | 278.603 |
| 0.7409722222222223 | 278.603 |
| 0.7416666666666667 | 274.047 |
| 0.7423611111111111 | 274.047 |
| 0.7430555555555555 | 274.047 |
| 0.74375 | 269.49 |
| 0.7444444444444445 | 269.49 |
| 0.7451388888888889 | 269.49 |
| 0.7458333333333332 | 264.932 |
| 0.7465277777777778 | 264.932 |
| 0.7472222222222222 | 264.932 |
| 0.7479166666666667 | 264.932 |
| 0.748611111111111 | 260.373 |
| 0.7493055555555556 | 260.373 |
| 0.75 | 260.373 |
| 0.7506944444444444 | 255.813 |
| 0.751388888888889 | 255.813 |
| 0.7520833333333333 | 251.251 |
| 0.7527777777777778 | 251.251 |
| 0.7534722222222222 | 246.689 |
| 0.7541666666666668 | 242.127 |
| 0.7548611111111111 | 242.127 |
| 0.7555555555555555 | 237.564 |
| 0.75625 | 233 |
| 0.7569444444444445 | 228.436 |
| 0.7576388888888889 | 228.436 |
| 0.7583333333333333 | 223.873 |
| 0.7590277777777777 | 219.309 |
| 0.7597222222222223 | 219.309 |
| 0.7604166666666666 | 214.746 |
| 0.7611111111111111 | 210.182 |
| 0.7618055555555556 | 210.182 |
| 0.7625000000000001 | 205.62 |
| 0.7631944444444444 | 205.62 |
| 0.7638888888888888 | 201.058 |
| 0.7645833333333334 | 201.058 |
| 0.7652777777777778 | 196.497 |
| 0.7659722222222222 | 191.937 |
| 0.7666666666666666 | 187.378 |
| 0.7673611111111112 | 182.82 |
| 0.7680555555555556 | 173.709 |
| 0.7687499999999999 | 173.709 |
| 0.7694444444444444 | 169.156 |
| 0.7701388888888889 | 169.156 |
| 0.7708333333333334 | 164.605 |
| 0.7715277777777777 | 164.605 |
| 0.7722222222222223 | 160.056 |
| 0.7729166666666667 | 160.056 |
| 0.7736111111111111 | 160.056 |
| 0.7743055555555555 | 160.056 |
| 0.775 | 155.509 |
| 0.7756944444444445 | 155.509 |
| 0.7763888888888889 | 150.964 |
| 0.7770833333333332 | 150.964 |
| 0.7777777777777778 | 146.423 |
| 0.7784722222222222 | 146.423 |
| 0.7791666666666667 | 146.423 |
| 0.779861111111111 | 141.884 |
| 0.7805555555555556 | 141.884 |
| 0.78125 | 141.884 |
| 0.7819444444444444 | 137.347 |
| 0.782638888888889 | 137.347 |
| 0.7833333333333333 | 132.814 |
| 0.7840277777777778 | 132.814 |
| 0.7847222222222222 | 132.814 |
| 0.7854166666666668 | 128.284 |
| 0.7861111111111111 | 128.284 |
| 0.7868055555555555 | 123.758 |
| 0.7875 | 123.758 |
| 0.7881944444444445 | 119.235 |
| 0.7888888888888889 | 119.235 |
| 0.7895833333333333 | 114.716 |
| 0.7902777777777777 | 114.716 |
| 0.7909722222222223 | 110.201 |
| 0.7916666666666666 | 110.201 |
| 0.7923611111111111 | 110.201 |
| 0.7930555555555556 | 105.69 |
| 0.7937500000000001 | 105.69 |
| 0.7944444444444444 | 105.69 |
| 0.7951388888888888 | 101.184 |
| 0.7958333333333334 | 101.184 |
| 0.7965277777777778 | 101.184 |
| 0.7972222222222222 | 96.682 |
| 0.7979166666666666 | 96.682 |
| 0.7986111111111112 | 92.184 |
| 0.7993055555555556 | 92.184 |
| 0.7999999999999999 | 92.184 |
| 0.8006944444444444 | 87.692 |
| 0.8013888888888889 | 87.692 |
| 0.8020833333333334 | 87.692 |
| 0.8027777777777777 | 83.205 |
| 0.8034722222222223 | 83.205 |
| 0.8041666666666667 | 83.205 |
| 0.8048611111111111 | 78.722 |
| 0.8055555555555555 | 78.722 |
| 0.80625 | 74.246 |
| 0.8069444444444445 | 74.246 |
| 0.8076388888888889 | 69.775 |
| 0.8083333333333332 | 69.775 |
| 0.8090277777777778 | 65.31 |
| 0.8097222222222222 | 65.31 |
| 0.8104166666666667 | 60.85 |
| 0.811111111111111 | 60.85 |
| 0.8118055555555556 | 56.398 |
| 0.8125 | 56.398 |
| 0.8131944444444444 | 56.398 |
| 0.813888888888889 | 51.951 |
| 0.8145833333333333 | 51.951 |
| 0.8152777777777778 | 47.511 |
| 0.8159722222222222 | 47.511 |
| 0.8166666666666668 | 47.511 |
| 0.8173611111111111 | 43.079 |
| 0.8180555555555555 | 43.079 |
| 0.81875 | 38.653 |
| 0.8194444444444445 | 38.653 |
| 0.8201388888888889 | 34.234 |
| 0.8208333333333333 | 34.234 |
| 0.8215277777777777 | 29.823 |
| 0.8222222222222223 | 29.823 |
| 0.8229166666666666 | 29.823 |
| 0.8236111111111111 | 25.419 |
| 0.8243055555555556 | 25.419 |
| 0.8250000000000001 | 21.024 |
| 0.8256944444444444 | 21.024 |
| 0.8263888888888888 | 21.024 |
| 0.8270833333333334 | 16.636 |
| 0.8277777777777778 | 16.636 |
| 0.8284722222222222 | 16.636 |
| 0.8291666666666666 | 12.257 |
| 0.8298611111111112 | 12.257 |
| 0.8305555555555556 | 12.257 |
| 0.8312499999999999 | 12.257 |
| 0.8319444444444444 | 7.887 |
| 0.8326388888888889 | 7.887 |
| 0.8333333333333334 | 7.887 |
| 0.8340277777777777 | 7.887 |
| 0.8347222222222223 | 3.525 |
| 0.8354166666666667 | 3.525 |
| 0.8361111111111111 | 3.525 |
| 0.8368055555555555 | 3.525 |
| 0.8375 | 3.525 |
| 0.8381944444444445 | 3.525 |
| 0.8388888888888889 | 3.525 |
| 0.8395833333333332 | 0 |
| 0.8402777777777778 | 3.525 |
| 0.8409722222222222 | 3.525 |
| 0.8416666666666667 | 0 |
| 0.842361111111111 | 0 |
| 0.8430555555555556 | 0 |
| 0.84375 | 0 |
| 0.8444444444444444 | 0 |
| 0.845138888888889 | 0 |
| 0.8458333333333333 | 0 |
| 0.8465277777777778 | 0 |
| 0.8472222222222222 | 0 |
| 0.8479166666666668 | 0 |
| 0.8486111111111111 | 0 |
| 0.8493055555555555 | 0 |
| 0.85 | 0 |
| 0.8506944444444445 | 0 |
| 0.8513888888888889 | 0 |
| 0.8520833333333333 | 0 |
| 0.8527777777777777 | 0 |
| 0.8534722222222223 | 0 |
| 0.8541666666666666 | 0 |
| 0.8548611111111111 | 0 |
| 0.8555555555555556 | 0 |
| 0.8562500000000001 | 0 |
| 0.8569444444444444 | 0 |
| 0.8576388888888888 | 0 |
| 0.8583333333333334 | 0 |
| 0.8590277777777778 | 0 |
| 0.8597222222222222 | 0 |
| 0.8604166666666666 | 0 |
| 0.8611111111111112 | 0 |
| 0.8618055555555556 | 0 |
| 0.8624999999999999 | 0 |
| 0.8631944444444444 | 0 |
| 0.8638888888888889 | 0 |
| 0.8645833333333334 | 0 |
| 0.8652777777777777 | 0 |
| 0.8659722222222223 | 0 |
| 0.8666666666666667 | 0 |
| 0.8673611111111111 | 0 |
| 0.8680555555555555 | 0 |
| 0.86875 | 0 |
| 0.8694444444444445 | 0 |
| 0.8701388888888889 | 0 |
| 0.8708333333333332 | 0 |
| 0.8715277777777778 | 0 |
| 0.8722222222222222 | 0 |
| 0.8729166666666667 | 0 |
| 0.873611111111111 | 0 |
| 0.8743055555555556 | 0 |
| 0.875 | 0 |
| 0.8756944444444444 | 0 |
| 0.876388888888889 | 0 |
| 0.8770833333333333 | 0 |
| 0.8777777777777778 | 0 |
| 0.8784722222222222 | 0 |
| 0.8791666666666668 | 0 |
| 0.8798611111111111 | 0 |
| 0.8805555555555555 | 0 |
| 0.88125 | 0 |
| 0.8819444444444445 | 0 |
| 0.8826388888888889 | 0 |
| 0.8833333333333333 | 0 |
| 0.8840277777777777 | 0 |
| 0.8847222222222223 | 0 |
| 0.8854166666666666 | 0 |
| 0.8861111111111111 | 0 |
| 0.8868055555555556 | 0 |
| 0.8875000000000001 | 0 |
| 0.8881944444444444 | 0 |
| 0.8888888888888888 | 0 |
| 0.8895833333333334 | 0 |
| 0.8902777777777778 | 0 |
| 0.8909722222222222 | 0 |
| 0.8916666666666666 | 0 |
| 0.8923611111111112 | 0 |
| 0.8930555555555556 | 0 |
| 0.8937499999999999 | 0 |
| 0.8944444444444444 | 0 |
| 0.8951388888888889 | 0 |
| 0.8958333333333334 | 0 |
| 0.8965277777777777 | 0 |
| 0.8972222222222223 | 0 |
| 0.8979166666666667 | 0 |
| 0.8986111111111111 | 0 |
| 0.8993055555555555 | 0 |
| 0.9 | 0 |
| 0.9006944444444445 | 0 |
| 0.9013888888888889 | 0 |
| 0.9020833333333332 | 0 |
| 0.9027777777777778 | 0 |
| 0.9034722222222222 | 0 |
| 0.9041666666666667 | 0 |
| 0.904861111111111 | 0 |
| 0.9055555555555556 | 0 |
| 0.90625 | 0 |
| 0.9069444444444444 | 0 |
| 0.907638888888889 | 0 |
| 0.9083333333333333 | 0 |
| 0.9090277777777778 | 0 |
| 0.9097222222222222 | 0 |
| 0.9104166666666668 | 0 |
| 0.9111111111111111 | 0 |
| 0.9118055555555555 | 0 |
| 0.9125 | 0 |
| 0.9131944444444445 | 0 |
| 0.9138888888888889 | 0 |
| 0.9145833333333333 | 0 |
| 0.9152777777777777 | 0 |
| 0.9159722222222223 | 0 |
| 0.9166666666666666 | 0 |
| 0.9173611111111111 | 0 |
| 0.9180555555555556 | 0 |
| 0.9187500000000001 | 0 |
| 0.9194444444444444 | 0 |
| 0.9201388888888888 | 0 |
| 0.9208333333333334 | 0 |
| 0.9215277777777778 | 0 |
| 0.9222222222222222 | 0 |
| 0.9229166666666666 | 0 |
| 0.9236111111111112 | 0 |
| 0.9243055555555556 | 0 |
| 0.9249999999999999 | 0 |
| 0.9256944444444444 | 0 |
| 0.9263888888888889 | 0 |
| 0.9270833333333334 | 0 |
| 0.9277777777777777 | 0 |
| 0.9284722222222223 | 0 |
| 0.9291666666666667 | 0 |
| 0.9298611111111111 | 0 |
| 0.9305555555555555 | 0 |
| 0.93125 | 0 |
| 0.9319444444444445 | 0 |
| 0.9326388888888889 | 0 |
| 0.9333333333333332 | 0 |
| 0.9340277777777778 | 0 |
| 0.9347222222222222 | 0 |
| 0.9354166666666667 | 0 |
| 0.936111111111111 | 0 |
| 0.9368055555555556 | 0 |
| 0.9375 | 0 |
| 0.9381944444444444 | 0 |
| 0.938888888888889 | 0 |
| 0.9395833333333333 | 0 |
| 0.9402777777777778 | 0 |
| 0.9409722222222222 | 0 |
| 0.9416666666666668 | 0 |
| 0.9423611111111111 | 0 |
| 0.9430555555555555 | 0 |
| 0.94375 | 0 |
| 0.9444444444444445 | 0 |
| 0.9451388888888889 | 0 |
| 0.9458333333333333 | 0 |
| 0.9465277777777777 | 0 |
| 0.9472222222222223 | 0 |
| 0.9479166666666666 | 0 |
| 0.9486111111111111 | 0 |
| 0.9493055555555556 | 0 |
| 0.9500000000000001 | 0 |
| 0.9506944444444444 | 0 |
| 0.9513888888888888 | 0 |
| 0.9520833333333334 | 0 |
| 0.9527777777777778 | 0 |
| 0.9534722222222222 | 0 |
| 0.9541666666666666 | 0 |
| 0.9548611111111112 | 0 |
| 0.9555555555555556 | 0 |
| 0.9562499999999999 | 0 |
| 0.9569444444444444 | 0 |
| 0.9576388888888889 | 0 |
| 0.9583333333333334 | 0 |
| 0.9590277777777777 | 0 |
| 0.9597222222222223 | 0 |
| 0.9604166666666667 | 0 |
| 0.9611111111111111 | 0 |
| 0.9618055555555555 | 0 |
| 0.9625 | 0 |
| 0.9631944444444445 | 0 |
| 0.9638888888888889 | 0 |
| 0.9645833333333332 | 0 |
| 0.9652777777777778 | 0 |
| 0.9659722222222222 | 0 |
| 0.9666666666666667 | 0 |
| 0.967361111111111 | 0 |
| 0.9680555555555556 | 0 |
| 0.96875 | 0 |
| 0.9694444444444444 | 0 |
| 0.970138888888889 | 0 |
| 0.9708333333333333 | 0 |
| 0.9715277777777778 | 0 |
| 0.9722222222222222 | 0 |
| 0.9729166666666668 | 0 |
| 0.9736111111111111 | 0 |
| 0.9743055555555555 | 0 |
| 0.975 | 0 |
| 0.9756944444444445 | 0 |
| 0.9763888888888889 | 0 |
| 0.9770833333333333 | 0 |
| 0.9777777777777777 | 0 |
| 0.9784722222222223 | 0 |
| 0.9791666666666666 | 0 |
| 0.9798611111111111 | 0 |
| 0.9805555555555556 | 0 |
| 0.9812500000000001 | 0 |
| 0.9819444444444444 | 0 |
| 0.9826388888888888 | 0 |
| 0.9833333333333334 | 0 |
| 0.9840277777777778 | 0 |
| 0.9847222222222222 | 0 |
| 0.9854166666666666 | 0 |
| 0.9861111111111112 | 0 |
| 0.9868055555555556 | 0 |
| 0.9874999999999999 | 0 |
| 0.9881944444444444 | 0 |
| 0.9888888888888889 | 0 |
| 0.9895833333333334 | 0 |
| 0.9902777777777777 | 0 |
| 0.9909722222222223 | 0 |
| 0.9916666666666667 | 0 |
| 0.9923611111111111 | 0 |
| 0.9930555555555555 | 0 |
| 0.99375 | 0 |
| 0.9944444444444445 | 0 |
| 0.9951388888888889 | 0 |
| 0.9958333333333332 | 0 |
| 0.9965277777777778 | 0 |
| 0.9972222222222222 | 0 |
| 0.9979166666666667 | 0 |
| 0.998611111111111 | 0 |
| 0.9993055555555556 | 0 |